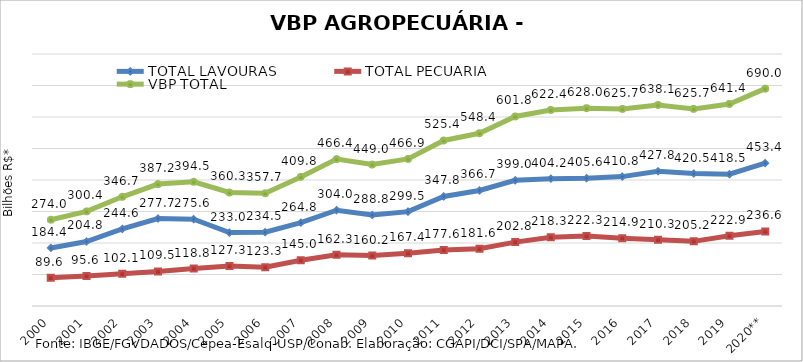
| Category | TOTAL LAVOURAS | TOTAL PECUÁRIA | VBP TOTAL |
|---|---|---|---|
| 2000 | 184.365 | 89.618 | 273.983 |
| 2001 | 204.795 | 95.611 | 300.406 |
| 2002 | 244.635 | 102.065 | 346.7 |
| 2003 | 277.659 | 109.549 | 387.208 |
| 2004 | 275.626 | 118.83 | 394.455 |
| 2005 | 233.029 | 127.295 | 360.325 |
| 2006 | 234.453 | 123.287 | 357.74 |
| 2007 | 264.772 | 145.04 | 409.812 |
| 2008 | 304.023 | 162.335 | 466.358 |
| 2009 | 288.782 | 160.223 | 449.005 |
| 2010 | 299.499 | 167.402 | 466.901 |
| 2011 | 347.831 | 177.571 | 525.402 |
| 2012 | 366.745 | 181.645 | 548.39 |
| 2013 | 399.021 | 202.784 | 601.806 |
| 2014 | 404.155 | 218.254 | 622.409 |
| 2015 | 405.622 | 222.341 | 627.962 |
| 2016 | 410.751 | 214.948 | 625.699 |
| 2017 | 427.817 | 210.329 | 638.146 |
| 2018 | 420.503 | 205.243 | 625.745 |
| 2019 | 418.488 | 222.866 | 641.354 |
| 2020** | 453.365 | 236.608 | 689.973 |